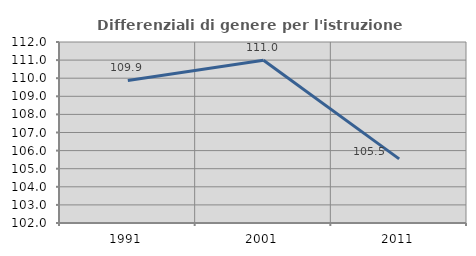
| Category | Differenziali di genere per l'istruzione superiore |
|---|---|
| 1991.0 | 109.873 |
| 2001.0 | 110.994 |
| 2011.0 | 105.542 |